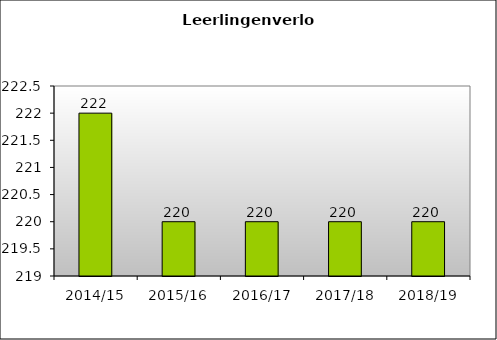
| Category | Series 0 |
|---|---|
| 2014/15 | 222 |
| 2015/16 | 220 |
| 2016/17 | 220 |
| 2017/18 | 220 |
| 2018/19 | 220 |